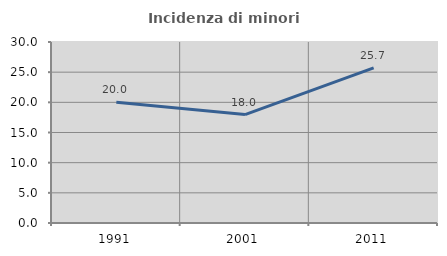
| Category | Incidenza di minori stranieri |
|---|---|
| 1991.0 | 20 |
| 2001.0 | 17.978 |
| 2011.0 | 25.725 |